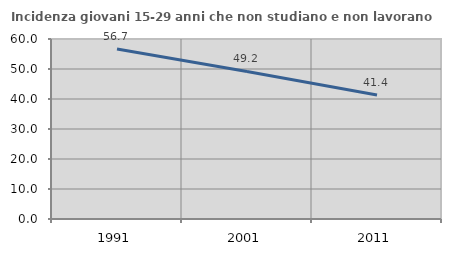
| Category | Incidenza giovani 15-29 anni che non studiano e non lavorano  |
|---|---|
| 1991.0 | 56.667 |
| 2001.0 | 49.198 |
| 2011.0 | 41.365 |